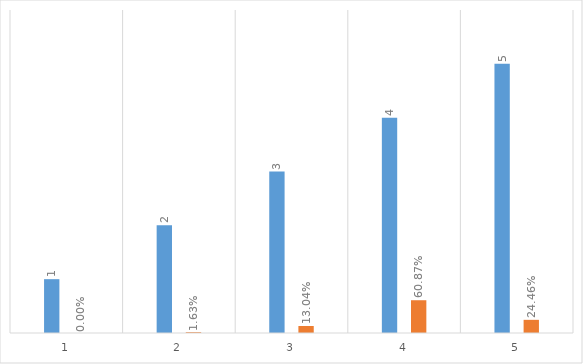
| Category | Series 0 | Series 1 |
|---|---|---|
| 0 | 1 | 0 |
| 1 | 2 | 0.016 |
| 2 | 3 | 0.13 |
| 3 | 4 | 0.609 |
| 4 | 5 | 0.245 |